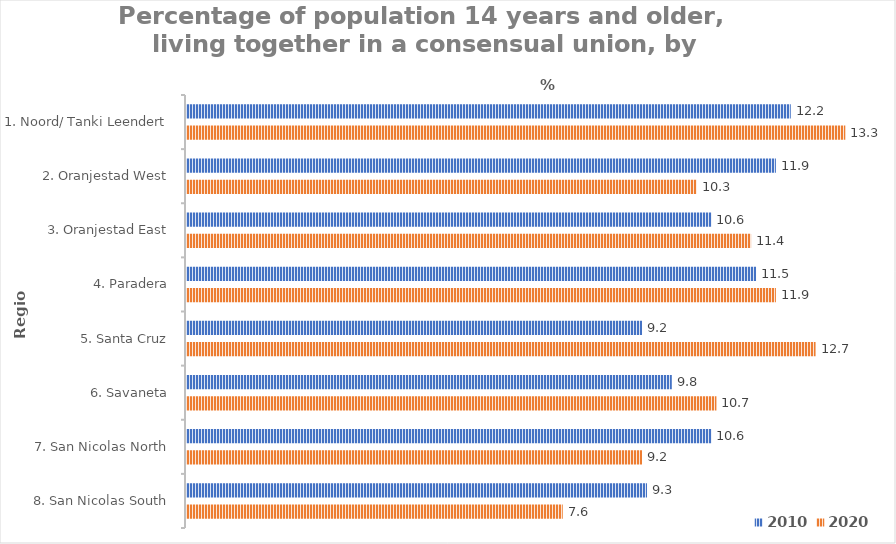
| Category | 2010 | 2020 |
|---|---|---|
| 1. Noord/ Tanki Leendert | 12.2 | 13.3 |
| 2. Oranjestad West | 11.9 | 10.3 |
| 3. Oranjestad East | 10.6 | 11.4 |
| 4. Paradera | 11.5 | 11.9 |
| 5. Santa Cruz | 9.2 | 12.7 |
| 6. Savaneta | 9.8 | 10.7 |
| 7. San Nicolas North | 10.6 | 9.2 |
| 8. San Nicolas South | 9.3 | 7.6 |